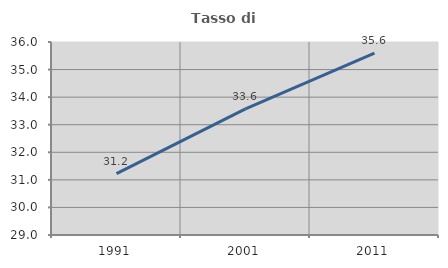
| Category | Tasso di occupazione   |
|---|---|
| 1991.0 | 31.224 |
| 2001.0 | 33.575 |
| 2011.0 | 35.6 |